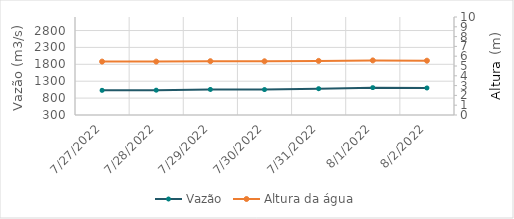
| Category | Vazão |
|---|---|
| 4/24/22 | 3070.75 |
| 4/23/22 | 2913.33 |
| 4/22/22 | 2479.67 |
| 4/21/22 | 2250.75 |
| 4/20/22 | 2208.37 |
| 4/19/22 | 2160.05 |
| 4/18/22 | 2123.08 |